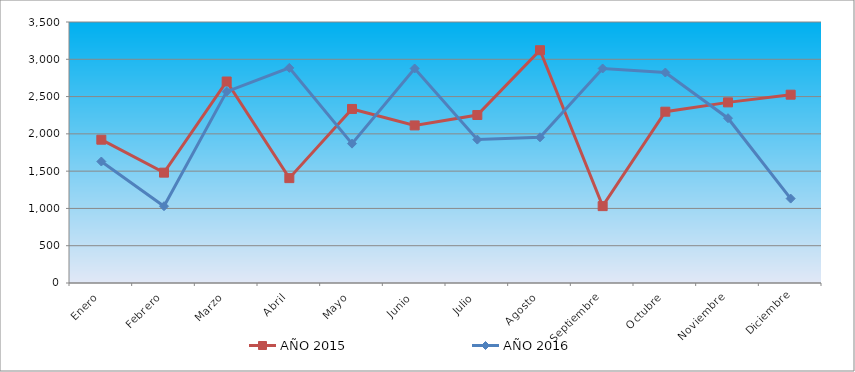
| Category | AÑO 2015 | AÑO 2016 |
|---|---|---|
| Enero | 1921.651 | 1628.99 |
| Febrero | 1479.893 | 1029.989 |
| Marzo | 2702.092 | 2566.59 |
| Abril | 1406.266 | 2884.506 |
| Mayo | 2333.96 | 1868.726 |
| Junio | 2113.08 | 2876.752 |
| Julio | 2252.971 | 1923.004 |
| Agosto | 3121.763 | 1954.02 |
| Septiembre | 1030.771 | 2876.752 |
| Octubre | 2297.147 | 2822.474 |
| Noviembre | 2422.312 | 2209.904 |
| Diciembre | 2525.389 | 1132.091 |